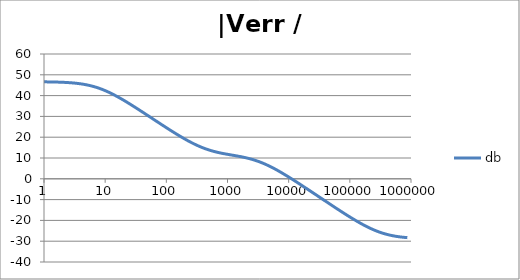
| Category | db |
|---|---|
| 1.0 | 46.616 |
| 1.0715193052376064 | 46.606 |
| 1.1481536214968828 | 46.593 |
| 1.2302687708123814 | 46.579 |
| 1.318256738556407 | 46.563 |
| 1.4125375446227544 | 46.545 |
| 1.513561248436208 | 46.524 |
| 1.6218100973589298 | 46.5 |
| 1.7378008287493754 | 46.473 |
| 1.8620871366628673 | 46.441 |
| 1.9952623149688797 | 46.406 |
| 2.1379620895022318 | 46.366 |
| 2.2908676527677727 | 46.32 |
| 2.45470891568503 | 46.267 |
| 2.6302679918953817 | 46.208 |
| 2.8183829312644537 | 46.141 |
| 3.0199517204020156 | 46.066 |
| 3.235936569296282 | 45.981 |
| 3.467368504525316 | 45.885 |
| 3.7153522909717256 | 45.777 |
| 3.9810717055349727 | 45.657 |
| 4.265795188015926 | 45.523 |
| 4.570881896148749 | 45.375 |
| 4.897788193684462 | 45.21 |
| 5.2480746024977245 | 45.028 |
| 5.62341325190349 | 44.828 |
| 6.025595860743575 | 44.609 |
| 6.456542290346554 | 44.371 |
| 6.918309709189363 | 44.113 |
| 7.4131024130091765 | 43.834 |
| 7.943282347242814 | 43.535 |
| 8.511380382023765 | 43.215 |
| 9.120108393559095 | 42.875 |
| 9.772372209558105 | 42.514 |
| 10.47128548050899 | 42.134 |
| 11.22018454301963 | 41.735 |
| 12.022644346174127 | 41.318 |
| 12.88249551693134 | 40.885 |
| 13.803842646028851 | 40.435 |
| 14.791083881682074 | 39.97 |
| 15.848931924611136 | 39.492 |
| 16.98243652461744 | 39 |
| 18.197008586099834 | 38.498 |
| 19.498445997580447 | 37.984 |
| 20.892961308540382 | 37.462 |
| 22.387211385683386 | 36.93 |
| 23.988329190194897 | 36.391 |
| 25.703957827688622 | 35.846 |
| 27.54228703338165 | 35.294 |
| 29.51209226666385 | 34.737 |
| 31.62277660168379 | 34.176 |
| 33.884415613920254 | 33.61 |
| 36.307805477010106 | 33.041 |
| 38.90451449942804 | 32.47 |
| 41.686938347033525 | 31.895 |
| 44.6683592150963 | 31.319 |
| 47.86300923226381 | 30.742 |
| 51.28613839913647 | 30.163 |
| 54.95408738576247 | 29.583 |
| 58.88436553555889 | 29.004 |
| 63.09573444801931 | 28.424 |
| 67.60829753919813 | 27.844 |
| 72.44359600749901 | 27.266 |
| 77.62471166286915 | 26.688 |
| 83.17637711026705 | 26.112 |
| 89.12509381337456 | 25.538 |
| 95.49925860214357 | 24.966 |
| 102.32929922807544 | 24.397 |
| 109.64781961431841 | 23.831 |
| 117.48975549395293 | 23.27 |
| 125.89254117941665 | 22.713 |
| 134.89628825916537 | 22.161 |
| 144.54397707459273 | 21.615 |
| 154.88166189124806 | 21.076 |
| 165.95869074375608 | 20.544 |
| 177.82794100389225 | 20.021 |
| 190.5460717963248 | 19.507 |
| 204.17379446695278 | 19.004 |
| 218.77616239495524 | 18.512 |
| 234.42288153199212 | 18.032 |
| 251.18864315095806 | 17.566 |
| 269.15348039269156 | 17.114 |
| 288.4031503126605 | 16.678 |
| 309.0295432513591 | 16.258 |
| 331.1311214825911 | 15.856 |
| 354.81338923357566 | 15.472 |
| 380.18939632056095 | 15.106 |
| 407.3802778041123 | 14.759 |
| 436.5158322401654 | 14.431 |
| 467.7351412871979 | 14.123 |
| 501.18723362727184 | 13.833 |
| 537.0317963702526 | 13.561 |
| 575.4399373371566 | 13.308 |
| 616.5950018614822 | 13.071 |
| 660.6934480075952 | 12.849 |
| 707.9457843841375 | 12.642 |
| 758.5775750291831 | 12.448 |
| 812.8305161640983 | 12.266 |
| 870.9635899560801 | 12.093 |
| 933.2543007969903 | 11.928 |
| 999.9999999999998 | 11.77 |
| 1071.5193052376057 | 11.615 |
| 1148.1536214968828 | 11.464 |
| 1230.2687708123801 | 11.313 |
| 1318.2567385564053 | 11.161 |
| 1412.537544622753 | 11.006 |
| 1513.5612484362066 | 10.846 |
| 1621.8100973589292 | 10.679 |
| 1737.8008287493742 | 10.504 |
| 1862.0871366628671 | 10.318 |
| 1995.2623149688786 | 10.121 |
| 2137.9620895022326 | 9.91 |
| 2290.867652767771 | 9.684 |
| 2454.708915685027 | 9.443 |
| 2630.26799189538 | 9.184 |
| 2818.382931264451 | 8.908 |
| 3019.9517204020176 | 8.613 |
| 3235.9365692962774 | 8.299 |
| 3467.368504525316 | 7.966 |
| 3715.352290971724 | 7.614 |
| 3981.07170553497 | 7.243 |
| 4265.795188015923 | 6.854 |
| 4570.881896148745 | 6.446 |
| 4897.788193684463 | 6.022 |
| 5248.074602497726 | 5.581 |
| 5623.413251903489 | 5.125 |
| 6025.595860743574 | 4.655 |
| 6456.54229034655 | 4.171 |
| 6918.309709189357 | 3.676 |
| 7413.102413009165 | 3.169 |
| 7943.282347242815 | 2.651 |
| 8511.380382023763 | 2.125 |
| 9120.108393559092 | 1.59 |
| 9772.3722095581 | 1.048 |
| 10471.285480509003 | 0.499 |
| 11220.184543019639 | -0.056 |
| 12022.64434617411 | -0.616 |
| 12882.495516931338 | -1.18 |
| 13803.842646028841 | -1.749 |
| 14791.083881682063 | -2.321 |
| 15848.931924611119 | -2.897 |
| 16982.436524617453 | -3.475 |
| 18197.008586099837 | -4.055 |
| 19498.445997580417 | -4.637 |
| 20892.961308540387 | -5.222 |
| 22387.211385683382 | -5.807 |
| 23988.32919019488 | -6.393 |
| 25703.957827688606 | -6.981 |
| 27542.28703338167 | -7.569 |
| 29512.092266663854 | -8.157 |
| 31622.77660168378 | -8.746 |
| 33884.41561392023 | -9.334 |
| 36307.805477010166 | -9.922 |
| 38904.514499428085 | -10.51 |
| 41686.93834703348 | -11.097 |
| 44668.35921509631 | -11.684 |
| 47863.00923226382 | -12.269 |
| 51286.13839913646 | -12.852 |
| 54954.08738576241 | -13.434 |
| 58884.365535558936 | -14.014 |
| 63095.73444801934 | -14.591 |
| 67608.29753919817 | -15.166 |
| 72443.59600749899 | -15.737 |
| 77624.71166286913 | -16.305 |
| 83176.37711026703 | -16.868 |
| 89125.09381337445 | -17.427 |
| 95499.25860214363 | -17.98 |
| 102329.29922807543 | -18.527 |
| 109647.81961431848 | -19.067 |
| 117489.75549395289 | -19.6 |
| 125892.54117941685 | -20.123 |
| 134896.28825916522 | -20.638 |
| 144543.97707459255 | -21.141 |
| 154881.66189124787 | -21.633 |
| 165958.69074375575 | -22.112 |
| 177827.9410038922 | -22.577 |
| 190546.07179632425 | -23.028 |
| 204173.79446695274 | -23.462 |
| 218776.16239495497 | -23.879 |
| 234422.88153199226 | -24.279 |
| 251188.64315095753 | -24.659 |
| 269153.480392691 | -25.02 |
| 288403.15031266044 | -25.361 |
| 309029.5432513582 | -25.682 |
| 331131.1214825907 | -25.981 |
| 354813.3892335749 | -26.26 |
| 380189.3963205612 | -26.519 |
| 407380.2778041119 | -26.757 |
| 436515.8322401649 | -26.976 |
| 467735.14128719777 | -27.176 |
| 501187.2336272717 | -27.359 |
| 537031.7963702519 | -27.524 |
| 575439.9373371559 | -27.673 |
| 616595.001861482 | -27.807 |
| 660693.4480075944 | -27.927 |
| 707945.7843841374 | -28.035 |
| 758577.575029183 | -28.131 |
| 812830.5161640996 | -28.216 |
| 870963.5899560791 | -28.292 |